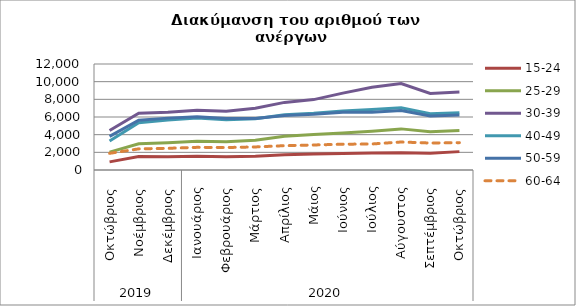
| Category | 15-24 | 25-29 | 30-39 | 40-49 | 50-59 | 60-64 |
|---|---|---|---|---|---|---|
| 0 | 919 | 2022 | 4478 | 3293 | 3811 | 1886 |
| 1 | 1537 | 2970 | 6427 | 5355 | 5640 | 2393 |
| 2 | 1503 | 3082 | 6550 | 5646 | 5873 | 2456 |
| 3 | 1553 | 3257 | 6759 | 5874 | 6042 | 2564 |
| 4 | 1509 | 3191 | 6656 | 5700 | 5841 | 2544 |
| 5 | 1555 | 3375 | 6990 | 5790 | 5839 | 2611 |
| 6 | 1729 | 3820 | 7653 | 6252 | 6167 | 2755 |
| 7 | 1820 | 4016 | 7970 | 6420 | 6304 | 2833 |
| 8 | 1873 | 4195 | 8705 | 6676 | 6525 | 2919 |
| 9 | 1925 | 4395 | 9372 | 6856 | 6551 | 2946 |
| 10 | 1953 | 4655 | 9784 | 7049 | 6737 | 3169 |
| 11 | 1894 | 4340 | 8659 | 6375 | 6113 | 3053 |
| 12 | 2080 | 4458 | 8822 | 6492 | 6235 | 3096 |